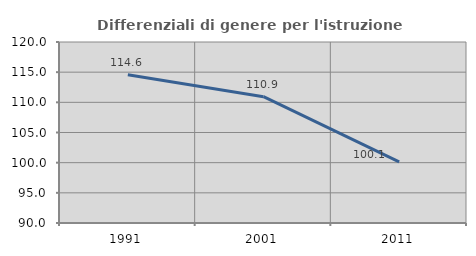
| Category | Differenziali di genere per l'istruzione superiore |
|---|---|
| 1991.0 | 114.564 |
| 2001.0 | 110.933 |
| 2011.0 | 100.118 |